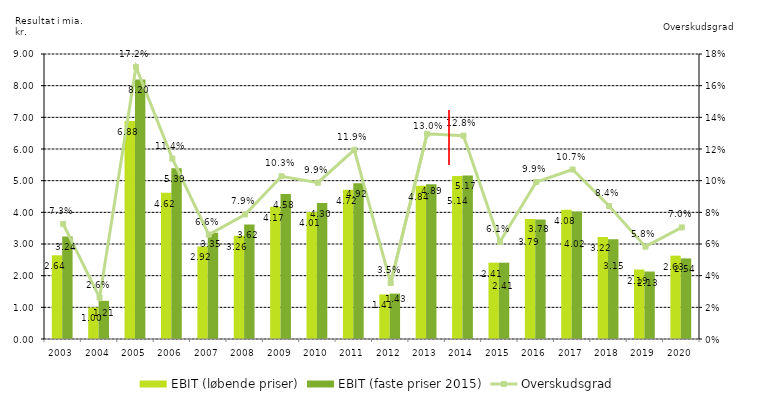
| Category | EBIT (løbende priser) | EBIT (faste priser 2015) |
|---|---|---|
| 2003.0 | 2.643 | 3.239 |
| 2004.0 | 0.995 | 1.206 |
| 2005.0 | 6.885 | 8.196 |
| 2006.0 | 4.616 | 5.393 |
| 2007.0 | 2.922 | 3.355 |
| 2008.0 | 3.26 | 3.618 |
| 2009.0 | 4.174 | 4.576 |
| 2010.0 | 4.007 | 4.295 |
| 2011.0 | 4.716 | 4.917 |
| 2012.0 | 1.408 | 1.434 |
| 2013.0 | 4.838 | 4.886 |
| 2014.0 | 5.145 | 5.165 |
| 2015.0 | 2.41 | 2.41 |
| 2016.0 | 3.787 | 3.776 |
| 2017.0 | 4.078 | 4.023 |
| 2018.0 | 3.22 | 3.151 |
| 2019.0 | 2.194 | 2.131 |
| 2020.0 | 2.631 | 2.545 |